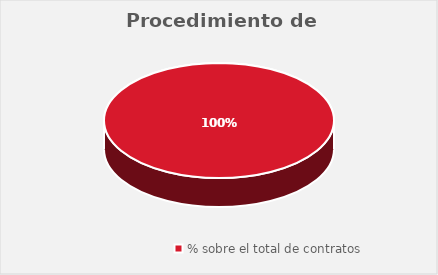
| Category | Procedimiento de celebración |
|---|---|
| % sobre el total de contratos | 1 |